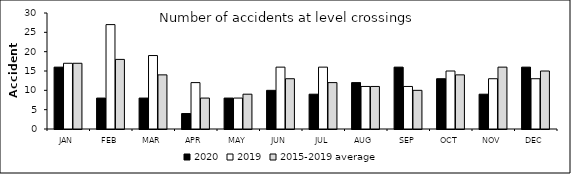
| Category | 2020 | 2019 | 2015-2019 average |
|---|---|---|---|
| JAN | 16 | 17 | 17 |
| FEB | 8 | 27 | 18 |
| MAR | 8 | 19 | 14 |
| APR | 4 | 12 | 8 |
| MAY | 8 | 8 | 9 |
| JUN | 10 | 16 | 13 |
| JUL | 9 | 16 | 12 |
| AUG | 12 | 11 | 11 |
| SEP | 16 | 11 | 10 |
| OCT | 13 | 15 | 14 |
| NOV | 9 | 13 | 16 |
| DEC | 16 | 13 | 15 |